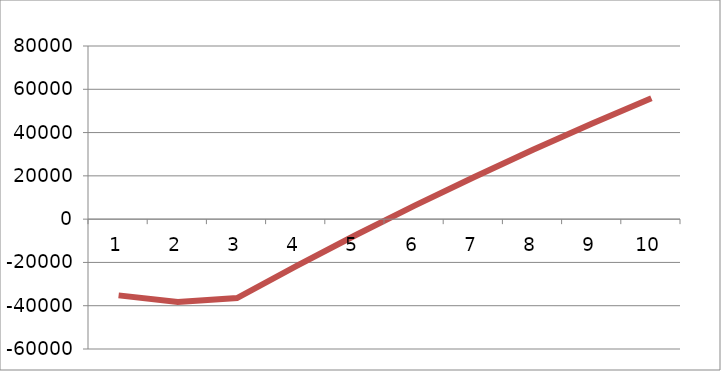
| Category | Series 1 |
|---|---|
| 1.0 | -35230 |
| 2.0 | -38315.577 |
| 3.0 | -36483.723 |
| 4.0 | -21683.712 |
| 5.0 | -7452.931 |
| 6.0 | 6230.511 |
| 7.0 | 19387.667 |
| 8.0 | 32038.779 |
| 9.0 | 44203.31 |
| 10.0 | 55899.974 |